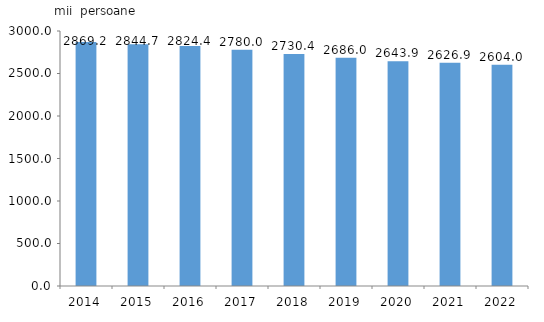
| Category | Populația la începutul anului,
1 ianuarie  |
|---|---|
| 2014.0 | 2869.226 |
| 2015.0 | 2844.673 |
| 2016.0 | 2824.387 |
| 2017.0 | 2779.952 |
| 2018.0 | 2730.364 |
| 2019.0 | 2686 |
| 2020.0 | 2643.9 |
| 2021.0 | 2626.942 |
| 2022.0 | 2604 |